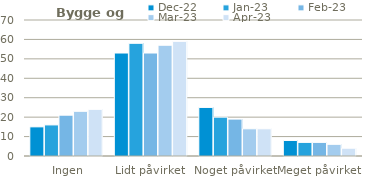
| Category | dec-22 | jan-23 | feb-23 | mar-23 | apr-23 |
|---|---|---|---|---|---|
| Ingen påvirkning | 15 | 16 | 21 | 23 | 24 |
| Lidt påvirket | 53 | 58 | 53 | 57 | 59 |
| Noget påvirket | 25 | 20 | 19 | 14 | 14 |
| Meget påvirket | 8 | 7 | 7 | 6 | 4 |